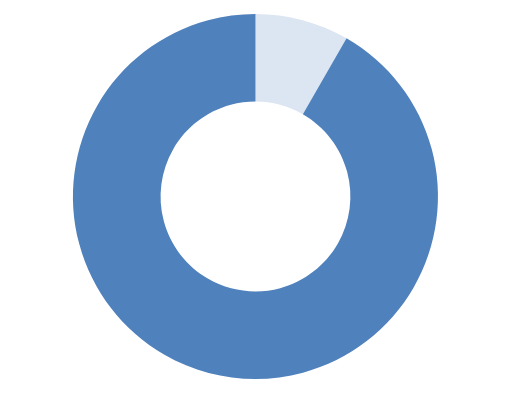
| Category | Series 0 |
|---|---|
| Basic Charge | 7.49 |
| Energy Charge | 82.61 |